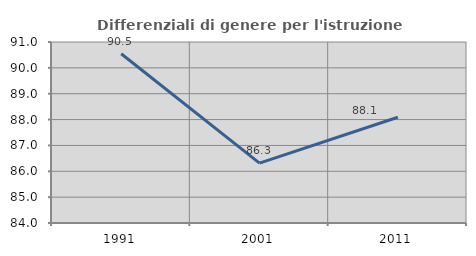
| Category | Differenziali di genere per l'istruzione superiore |
|---|---|
| 1991.0 | 90.545 |
| 2001.0 | 86.318 |
| 2011.0 | 88.088 |